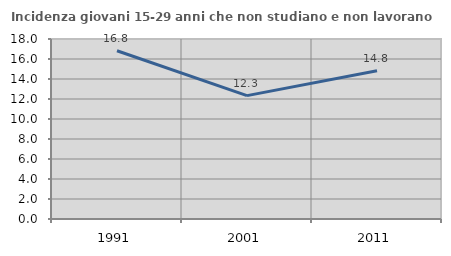
| Category | Incidenza giovani 15-29 anni che non studiano e non lavorano  |
|---|---|
| 1991.0 | 16.821 |
| 2001.0 | 12.338 |
| 2011.0 | 14.826 |